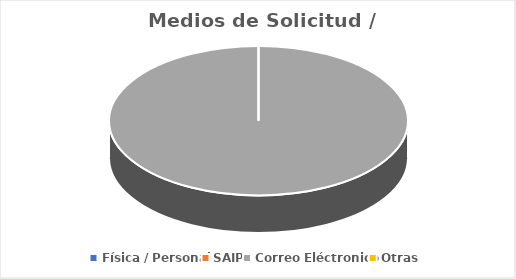
| Category | Series 0 |
|---|---|
| Física / Personal | 0 |
| SAIP | 0 |
| Correo Eléctronico | 2 |
| Otras | 0 |